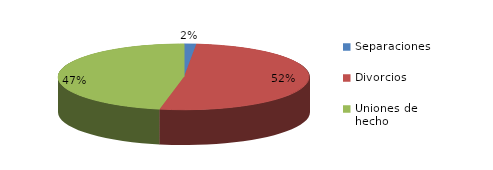
| Category | Series 0 |
|---|---|
| Separaciones | 12 |
| Divorcios | 400 |
| Uniones de hecho | 364 |